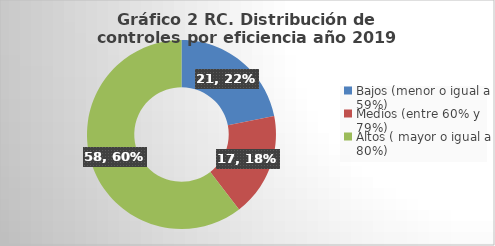
| Category | Series 2 |
|---|---|
| Bajos (menor o igual a 59%) | 21 |
| Medios (entre 60% y 79%) | 17 |
| Altos ( mayor o igual a 80%) | 58 |